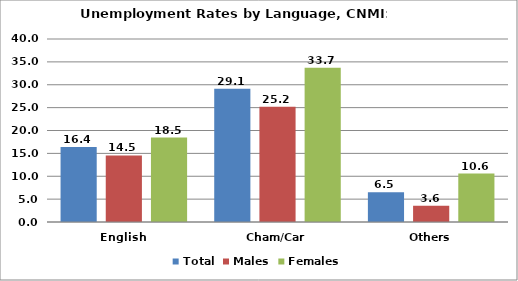
| Category | Total | Males | Females |
|---|---|---|---|
| English | 16.388 | 14.543 | 18.464 |
| Cham/Car | 29.135 | 25.183 | 33.705 |
| Others | 6.528 | 3.562 | 10.599 |